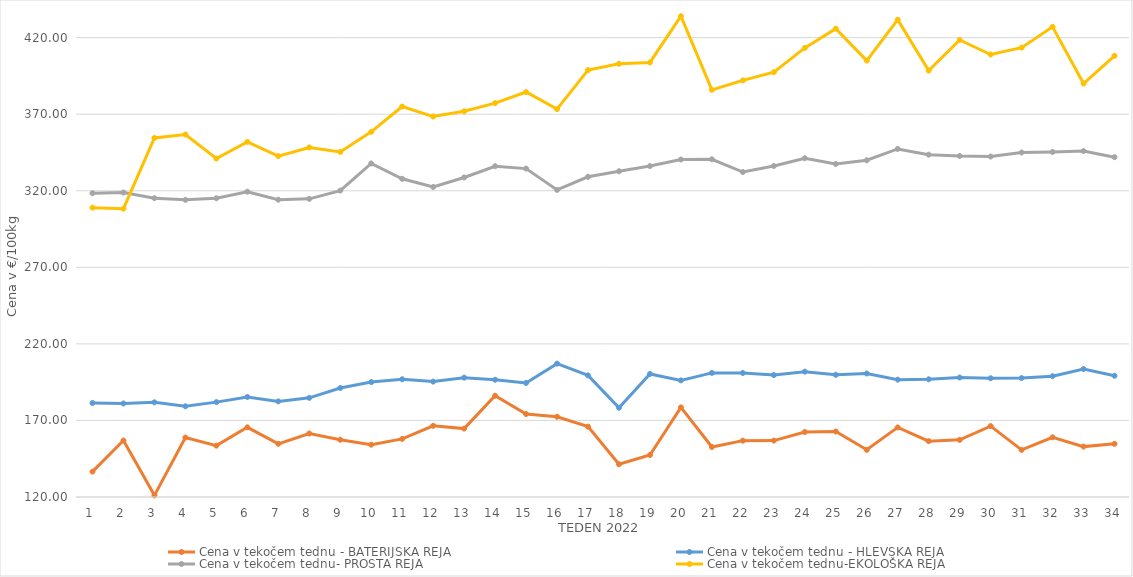
| Category | Cena v tekočem tednu - BATERIJSKA REJA | Cena v tekočem tednu - HLEVSKA REJA | Cena v tekočem tednu- PROSTA REJA | Cena v tekočem tednu-EKOLOŠKA REJA |
|---|---|---|---|---|
| 1.0 | 136.59 | 181.38 | 318.4 | 308.97 |
| 2.0 | 156.88 | 181.07 | 318.82 | 308.28 |
| 3.0 | 121.07 | 181.83 | 315.14 | 354.48 |
| 4.0 | 158.82 | 179.22 | 314.08 | 356.72 |
| 5.0 | 153.55 | 181.96 | 315.1 | 341.03 |
| 6.0 | 165.51 | 185.31 | 319.38 | 351.9 |
| 7.0 | 154.74 | 182.45 | 314.16 | 342.59 |
| 8.0 | 161.48 | 184.77 | 314.71 | 348.28 |
| 9.0 | 157.38 | 191.21 | 320.1 | 345.35 |
| 10.0 | 154.16 | 195.04 | 337.83 | 358.45 |
| 11.0 | 157.96 | 196.88 | 327.79 | 375 |
| 12.0 | 166.49 | 195.36 | 322.46 | 368.45 |
| 13.0 | 164.66 | 197.95 | 328.67 | 371.9 |
| 14.0 | 186.11 | 196.59 | 336.02 | 377.24 |
| 15.0 | 174.18 | 194.49 | 334.46 | 384.48 |
| 16.0 | 172.42 | 207.1 | 320.58 | 373.28 |
| 17.0 | 165.96 | 199.41 | 329.11 | 398.79 |
| 18.0 | 141.36 | 178.29 | 332.71 | 402.93 |
| 19.0 | 147.43 | 200.37 | 336.11 | 403.79 |
| 20.0 | 178.51 | 196.16 | 340.4 | 433.97 |
| 21.0 | 152.67 | 201.05 | 340.55 | 385.86 |
| 22.0 | 156.8 | 200.98 | 332.23 | 392.07 |
| 23.0 | 156.84 | 199.63 | 336.16 | 397.41 |
| 24.0 | 162.44 | 201.86 | 341.24 | 413.28 |
| 25.0 | 162.78 | 199.81 | 337.48 | 425.86 |
| 26.0 | 150.82 | 200.65 | 339.9 | 405 |
| 27.0 | 165.45 | 196.64 | 347.3 | 431.72 |
| 28.0 | 156.46 | 196.88 | 343.56 | 398.45 |
| 29.0 | 157.31 | 198.03 | 342.71 | 418.45 |
| 30.0 | 166.29 | 197.55 | 342.35 | 408.97 |
| 31.0 | 150.81 | 197.66 | 344.97 | 413.45 |
| 32.0 | 158.99 | 198.9 | 345.35 | 427.07 |
| 33.0 | 152.91 | 203.57 | 345.9 | 390 |
| 34.0 | 154.73 | 199.17 | 341.92 | 408.1 |